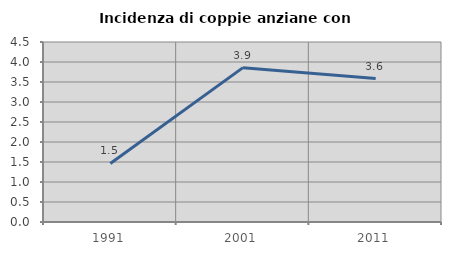
| Category | Incidenza di coppie anziane con figli |
|---|---|
| 1991.0 | 1.464 |
| 2001.0 | 3.859 |
| 2011.0 | 3.585 |